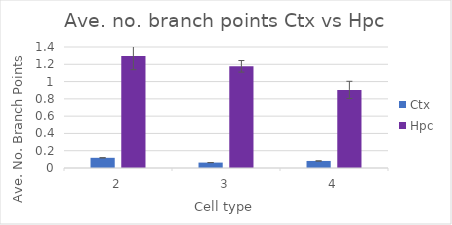
| Category | Ctx | Hpc |
|---|---|---|
| 2.0 | 0.118 | 1.296 |
| 3.0 | 0.063 | 1.176 |
| 4.0 | 0.081 | 0.904 |